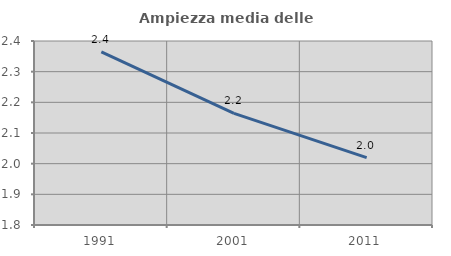
| Category | Ampiezza media delle famiglie |
|---|---|
| 1991.0 | 2.365 |
| 2001.0 | 2.164 |
| 2011.0 | 2.02 |